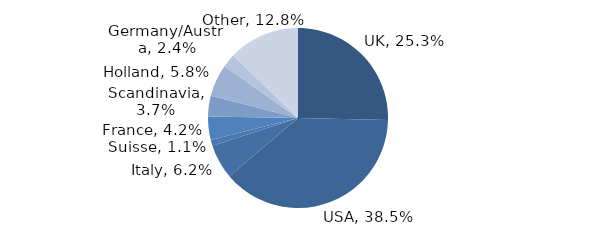
| Category | Investment Style |
|---|---|
| UK | 0.253 |
| USA | 0.385 |
| Italy | 0.062 |
| Suisse | 0.011 |
| France | 0.042 |
| Scandinavia | 0.037 |
| Holland | 0.058 |
| Germany/Austria | 0.024 |
| Other | 0.128 |